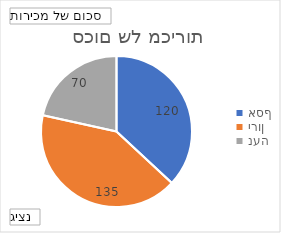
| Category | סה"כ |
|---|---|
| אסף | 120 |
| ירון | 135 |
| נעה | 70 |